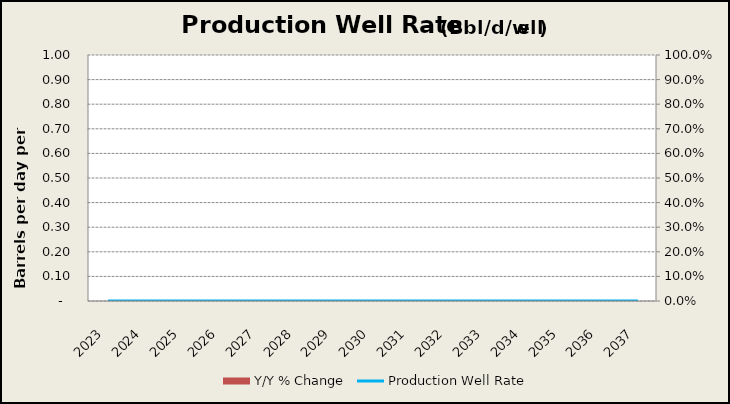
| Category | Y/Y % Change |
|---|---|
| 2023.0 | 0 |
| 2024.0 | 0 |
| 2025.0 | 0 |
| 2026.0 | 0 |
| 2027.0 | 0 |
| 2028.0 | 0 |
| 2029.0 | 0 |
| 2030.0 | 0 |
| 2031.0 | 0 |
| 2032.0 | 0 |
| 2033.0 | 0 |
| 2034.0 | 0 |
| 2035.0 | 0 |
| 2036.0 | 0 |
| 2037.0 | 0 |